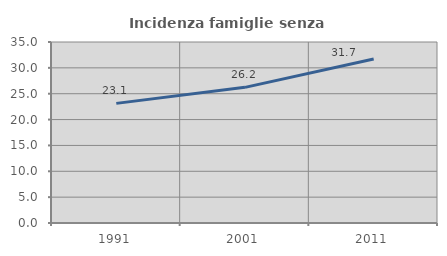
| Category | Incidenza famiglie senza nuclei |
|---|---|
| 1991.0 | 23.134 |
| 2001.0 | 26.233 |
| 2011.0 | 31.697 |